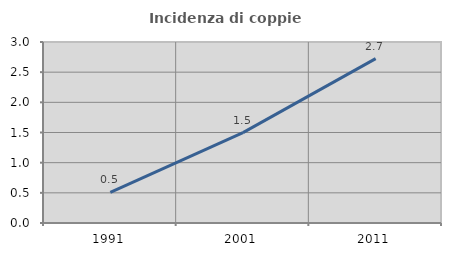
| Category | Incidenza di coppie miste |
|---|---|
| 1991.0 | 0.509 |
| 2001.0 | 1.497 |
| 2011.0 | 2.724 |